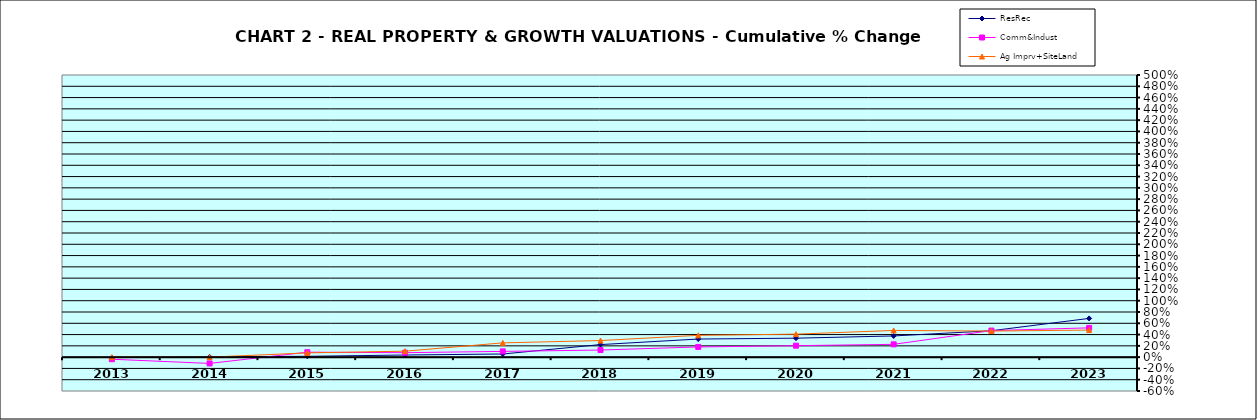
| Category | ResRec | Comm&Indust | Ag Imprv+SiteLand |
|---|---|---|---|
| 2013.0 | -0.007 | -0.037 | 0 |
| 2014.0 | 0.005 | -0.111 | 0 |
| 2015.0 | 0.015 | 0.088 | 0.075 |
| 2016.0 | 0.038 | 0.079 | 0.106 |
| 2017.0 | 0.056 | 0.102 | 0.253 |
| 2018.0 | 0.223 | 0.126 | 0.294 |
| 2019.0 | 0.321 | 0.181 | 0.387 |
| 2020.0 | 0.336 | 0.203 | 0.408 |
| 2021.0 | 0.376 | 0.227 | 0.473 |
| 2022.0 | 0.468 | 0.471 | 0.462 |
| 2023.0 | 0.687 | 0.519 | 0.48 |